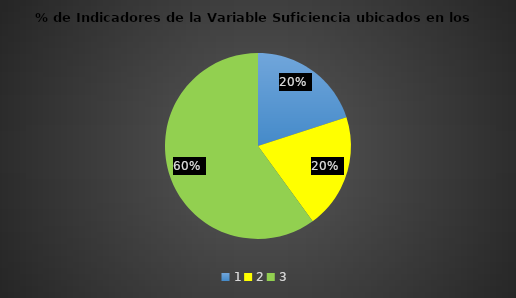
| Category | Series 0 |
|---|---|
| 0 | 0.2 |
| 1 | 0.2 |
| 2 | 0.6 |